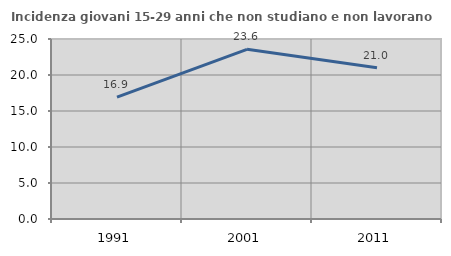
| Category | Incidenza giovani 15-29 anni che non studiano e non lavorano  |
|---|---|
| 1991.0 | 16.916 |
| 2001.0 | 23.569 |
| 2011.0 | 21.012 |